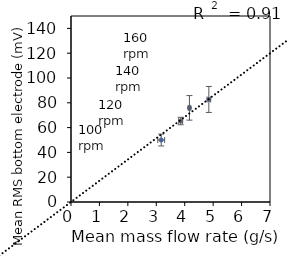
| Category | Series 0 |
|---|---|
| 3.1734999999999993 | 49.968 |
| 3.8581333333333334 | 65.305 |
| 4.166566666666667 | 75.919 |
| 4.848633333333333 | 82.694 |